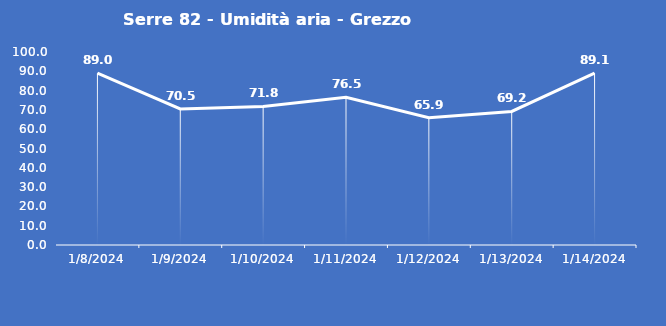
| Category | Serre 82 - Umidità aria - Grezzo (%) |
|---|---|
| 1/8/24 | 89 |
| 1/9/24 | 70.5 |
| 1/10/24 | 71.8 |
| 1/11/24 | 76.5 |
| 1/12/24 | 65.9 |
| 1/13/24 | 69.2 |
| 1/14/24 | 89.1 |